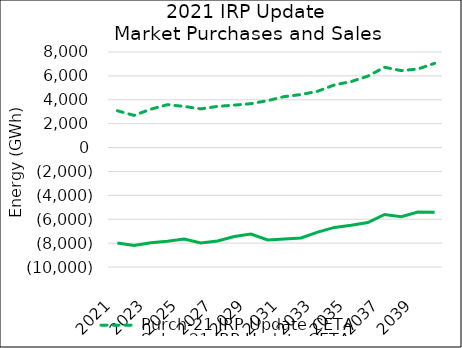
| Category | Purch-21 IRP Update CETA | Sales-21 IRP Update CETA |
|---|---|---|
| 2021.0 | 3083.328 | -7982.015 |
| 2022.0 | 2690.64 | -8197.246 |
| 2023.0 | 3212.992 | -7979.092 |
| 2024.0 | 3588.095 | -7841.046 |
| 2025.0 | 3444.895 | -7660.095 |
| 2026.0 | 3236.476 | -7989.066 |
| 2027.0 | 3448.859 | -7814.876 |
| 2028.0 | 3551.768 | -7453.487 |
| 2029.0 | 3675.265 | -7237.946 |
| 2030.0 | 3926.76 | -7732.141 |
| 2031.0 | 4266.381 | -7651.844 |
| 2032.0 | 4440.504 | -7563.336 |
| 2033.0 | 4715.603 | -7082.511 |
| 2034.0 | 5244.919 | -6686.282 |
| 2035.0 | 5524.79 | -6498.491 |
| 2036.0 | 5981.542 | -6274.109 |
| 2037.0 | 6721.502 | -5601.822 |
| 2038.0 | 6440.328 | -5785.283 |
| 2039.0 | 6578.152 | -5400.675 |
| 2040.0 | 7054.364 | -5406.574 |